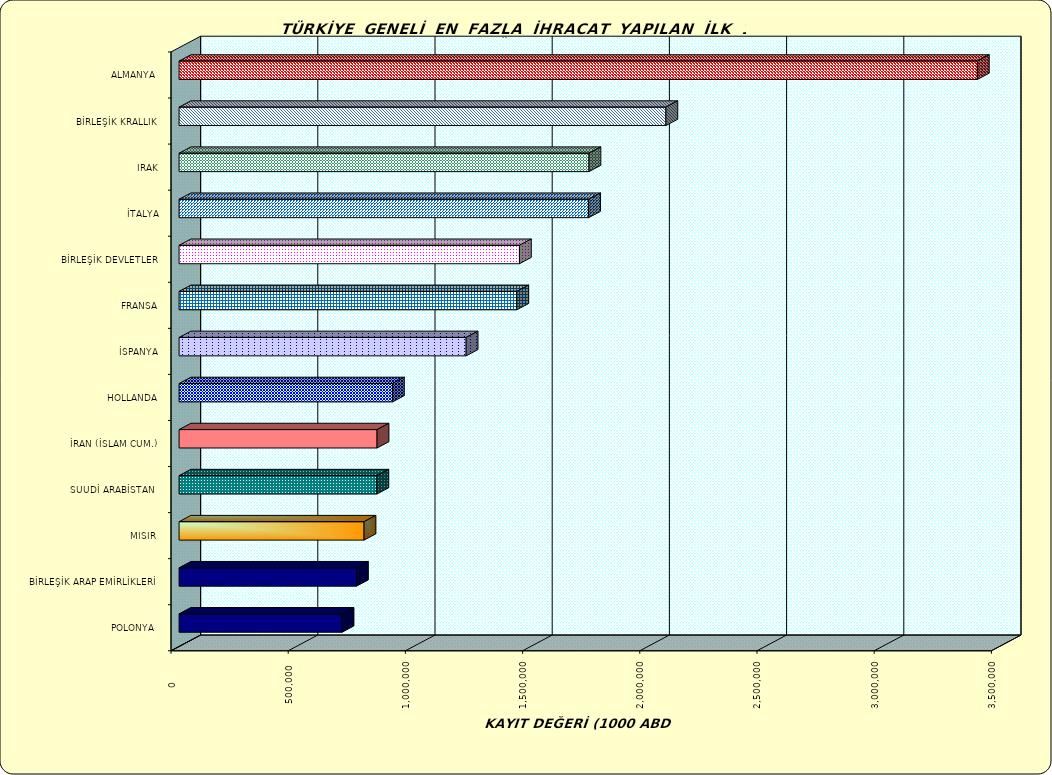
| Category | Series 0 |
|---|---|
| ALMANYA  | 3405734.37 |
| BİRLEŞİK KRALLIK | 2077000.019 |
| IRAK | 1748793.819 |
| İTALYA | 1747399.31 |
| BİRLEŞİK DEVLETLER | 1452091.073 |
| FRANSA | 1440975.719 |
| İSPANYA | 1224730.433 |
| HOLLANDA | 910373.034 |
| İRAN (İSLAM CUM.) | 844686.613 |
| SUUDİ ARABİSTAN  | 843938.705 |
| MISIR  | 789126.728 |
| BİRLEŞİK ARAP EMİRLİKLERİ | 756883.021 |
| POLONYA  | 695386.427 |